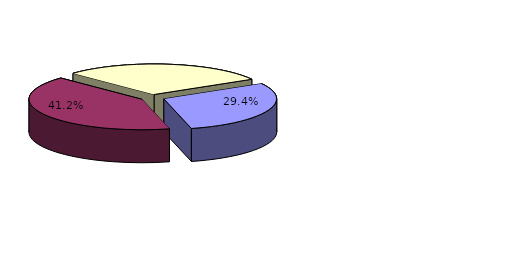
| Category | Series 0 |
|---|---|
| filarmoniyalar | 5 |
| konsert zalları | 7 |
| müstəqil kollektivlər | 5 |